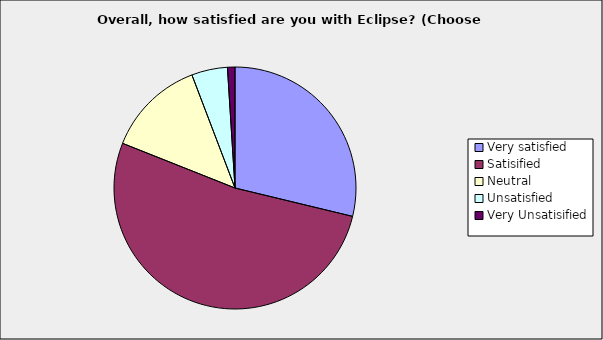
| Category | Series 0 |
|---|---|
| Very satisfied | 0.288 |
| Satisified | 0.523 |
| Neutral | 0.132 |
| Unsatisfied | 0.048 |
| Very Unsatisified | 0.01 |